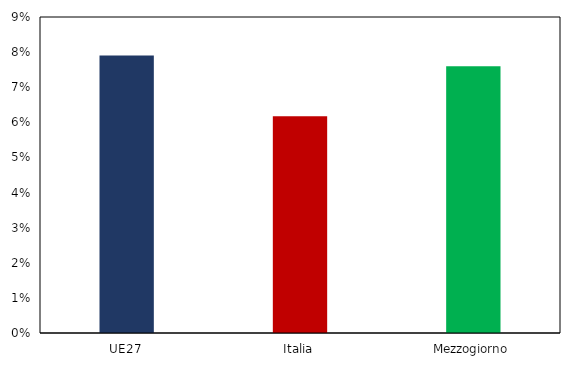
| Category | Series 0 |
|---|---|
| UE27 | 0.079 |
| Italia | 0.062 |
| Mezzogiorno | 0.076 |